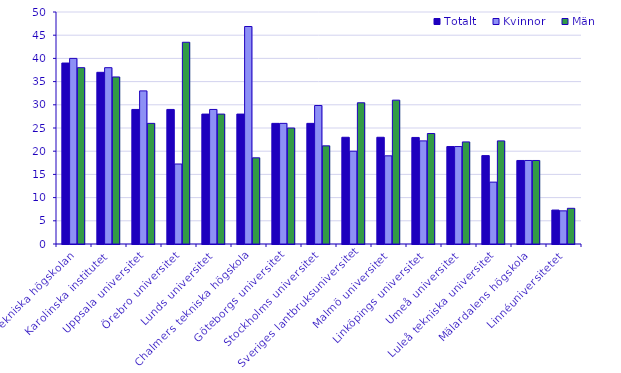
| Category | Totalt | Kvinnor | Män |
|---|---|---|---|
| Kungl. Tekniska högskolan | 39 | 40 | 38 |
| Karolinska institutet | 37 | 38 | 36 |
| Uppsala universitet | 29 | 33 | 26 |
| Örebro universitet | 29 | 17.241 | 43.478 |
| Lunds universitet | 28 | 29 | 28 |
| Chalmers tekniska högskola | 28 | 46.875 | 18.571 |
| Göteborgs universitet | 26 | 26 | 25 |
| Stockholms universitet | 26 | 29.851 | 21.154 |
| Sveriges lantbruksuniversitet | 23 | 20 | 30.435 |
| Malmö universitet | 23 | 19 | 31 |
| Linköpings universitet | 22.963 | 22.222 | 23.81 |
| Umeå universitet | 21 | 21 | 22 |
| Luleå tekniska universitet | 19.048 | 13.333 | 22.222 |
| Mälardalens högskola | 18 | 18 | 18 |
| Linnéuniversitetet | 7.317 | 7.143 | 7.692 |